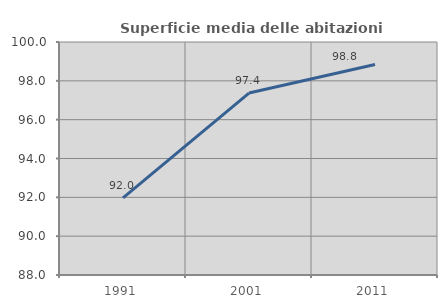
| Category | Superficie media delle abitazioni occupate |
|---|---|
| 1991.0 | 91.972 |
| 2001.0 | 97.372 |
| 2011.0 | 98.846 |